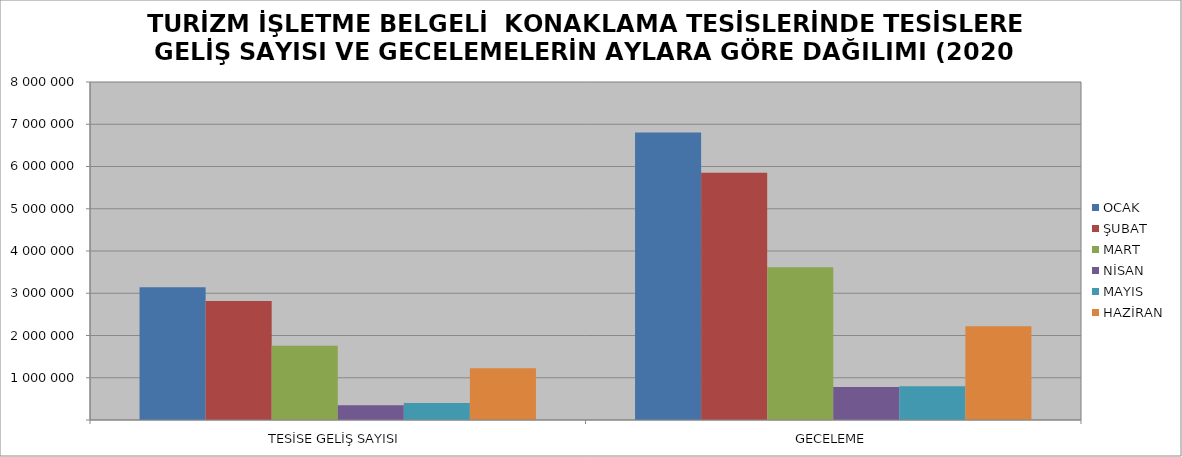
| Category | OCAK | ŞUBAT | MART | NİSAN | MAYIS | HAZİRAN |
|---|---|---|---|---|---|---|
| TESİSE GELİŞ SAYISI | 3140857 | 2816145 | 1756166 | 346964 | 400777 | 1222339 |
| GECELEME | 6806196 | 5853519 | 3616071 | 781724 | 800953 | 2221474 |